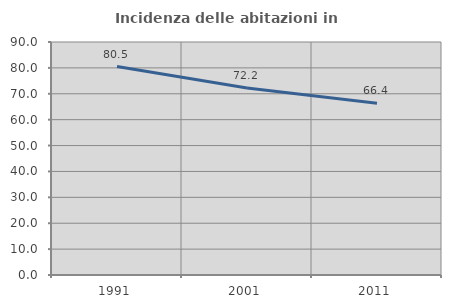
| Category | Incidenza delle abitazioni in proprietà  |
|---|---|
| 1991.0 | 80.51 |
| 2001.0 | 72.218 |
| 2011.0 | 66.355 |